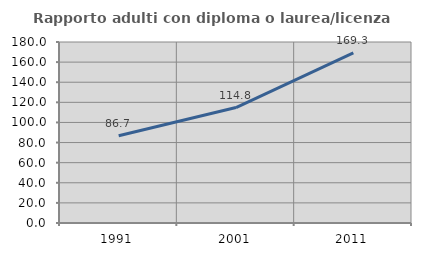
| Category | Rapporto adulti con diploma o laurea/licenza media  |
|---|---|
| 1991.0 | 86.719 |
| 2001.0 | 114.78 |
| 2011.0 | 169.253 |